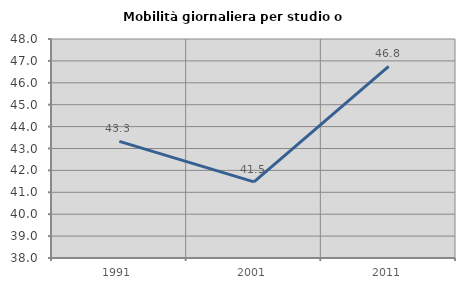
| Category | Mobilità giornaliera per studio o lavoro |
|---|---|
| 1991.0 | 43.325 |
| 2001.0 | 41.474 |
| 2011.0 | 46.754 |